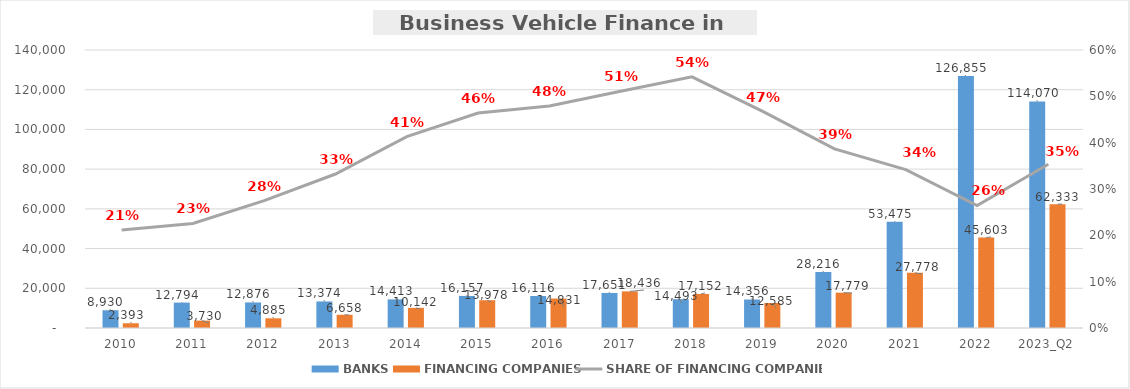
| Category | BANKS | FINANCING COMPANIES |
|---|---|---|
| 2010 | 8930.131 | 2392.721 |
| 2011 | 12793.723 | 3729.987 |
| 2012 | 12876.346 | 4885.495 |
| 2013 | 13374.424 | 6657.806 |
| 2014 | 14412.767 | 10141.887 |
| 2015 | 16157.225 | 13978.426 |
| 2016 | 16116.463 | 14831.249 |
| 2017 | 17650.963 | 18436.034 |
| 2018 | 14492.83 | 17152.034 |
| 2019 | 14355.978 | 12584.792 |
| 2020 | 28216.157 | 17779.072 |
| 2021 | 53475.488 | 27778.353 |
| 2022 | 126855.404 | 45602.871 |
| 2023_Q2 | 114069.764 | 62333.318 |